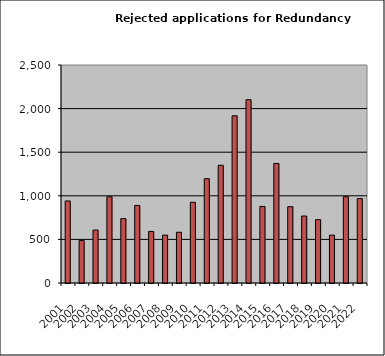
| Category | Series 1 |
|---|---|
| 2001.0 | 941 |
| 2002.0 | 486 |
| 2003.0 | 607 |
| 2004.0 | 989 |
| 2005.0 | 738 |
| 2006.0 | 889 |
| 2007.0 | 591 |
| 2008.0 | 549 |
| 2009.0 | 582 |
| 2010.0 | 926 |
| 2011.0 | 1196 |
| 2012.0 | 1350 |
| 2013.0 | 1917 |
| 2014.0 | 2102 |
| 2015.0 | 878 |
| 2016.0 | 1371 |
| 2017.0 | 875 |
| 2018.0 | 768 |
| 2019.0 | 726 |
| 2020.0 | 549 |
| 2021.0 | 990 |
| 2022.0 | 968 |